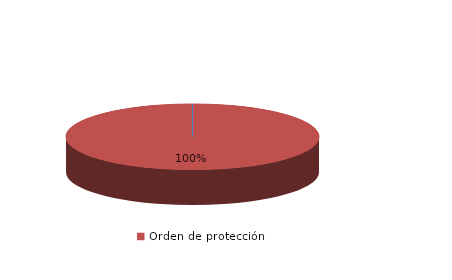
| Category | Series 0 |
|---|---|
| Orden de alejamiento | 0 |
| Orden de protección | 3 |